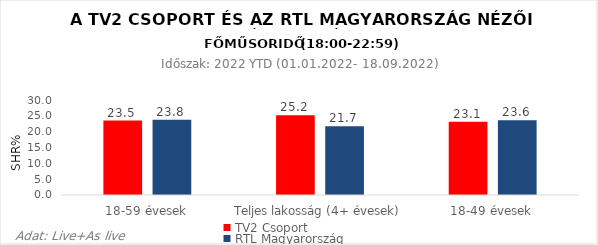
| Category | TV2 Csoport | RTL Magyarország |
|---|---|---|
| 18-59 évesek | 23.5 | 23.8 |
| Teljes lakosság (4+ évesek) | 25.2 | 21.7 |
| 18-49 évesek | 23.1 | 23.6 |